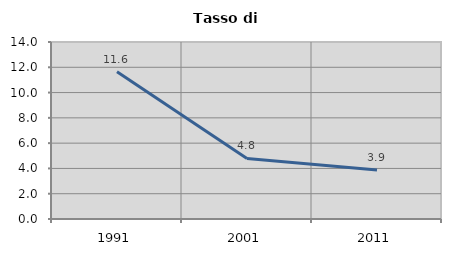
| Category | Tasso di disoccupazione   |
|---|---|
| 1991.0 | 11.648 |
| 2001.0 | 4.795 |
| 2011.0 | 3.877 |